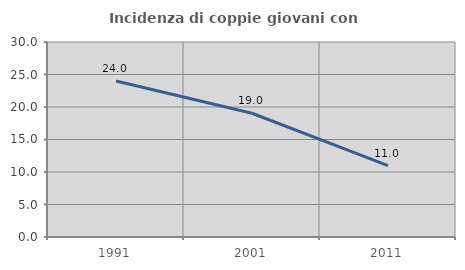
| Category | Incidenza di coppie giovani con figli |
|---|---|
| 1991.0 | 24 |
| 2001.0 | 19.037 |
| 2011.0 | 10.987 |